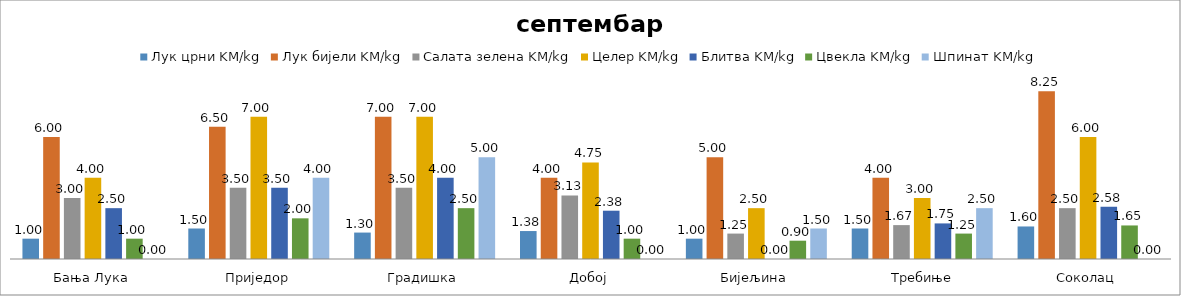
| Category | Лук црни KM/kg | Лук бијели KM/kg | Салата зелена KM/kg | Целер KM/kg | Блитва KM/kg | Цвекла KM/kg | Шпинат KM/kg |
|---|---|---|---|---|---|---|---|
| Бања Лука | 1 | 6 | 3 | 4 | 2.5 | 1 | 0 |
| Приједор | 1.5 | 6.5 | 3.5 | 7 | 3.5 | 2 | 4 |
| Градишка | 1.3 | 7 | 3.5 | 7 | 4 | 2.5 | 5 |
| Добој | 1.375 | 4 | 3.125 | 4.75 | 2.375 | 1 | 0 |
| Бијељина | 1 | 5 | 1.25 | 2.5 | 0 | 0.9 | 1.5 |
|  Требиње | 1.5 | 4 | 1.667 | 3 | 1.75 | 1.25 | 2.5 |
| Соколац | 1.6 | 8.25 | 2.5 | 6 | 2.575 | 1.65 | 0 |